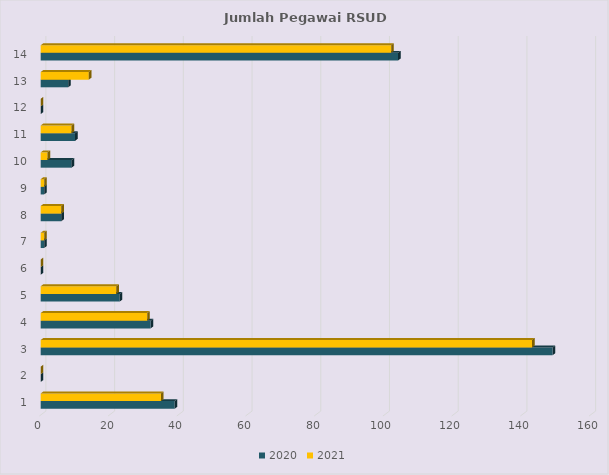
| Category | 2020 | 2021 |
|---|---|---|
| DOKTER | 39 | 35 |
| PSIKOLOGI KLINIS | 0 | 0 |
| KEPERAWATAN | 149 | 143 |
| KEBIDANAN | 32 | 31 |
| KEFARMASIAN | 23 | 22 |
| KESEHATAN MASYARAKAT | 0 | 0 |
| KESEHATAN LINGKUNGAN | 1 | 1 |
| GIZI | 6 | 6 |
| KETERAPIAN FISIK | 1 | 1 |
| KETEKNISIAN MEDIS | 9 | 2 |
| TEKNIK BIOMEDIKA | 10 | 9 |
| KESEHATAN TRADISIONAL | 0 | 0 |
| ASISTEN TENAGA KESEHATAN | 8 | 14 |
| TENAGA PENUNJANG | 104 | 102 |